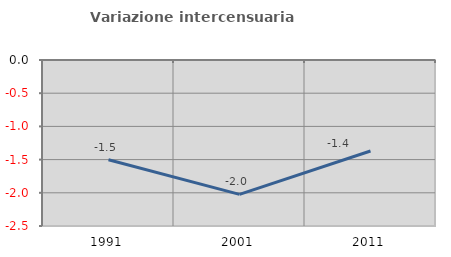
| Category | Variazione intercensuaria annua |
|---|---|
| 1991.0 | -1.503 |
| 2001.0 | -2.024 |
| 2011.0 | -1.37 |